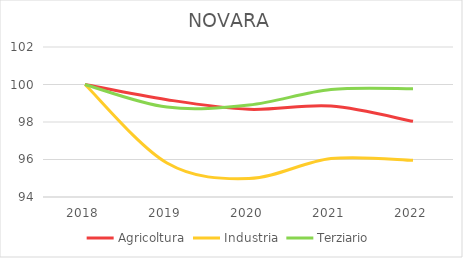
| Category | Agricoltura | Industria | Terziario |
|---|---|---|---|
| 2018.0 | 100 | 100 | 100 |
| 2019.0 | 99.189 | 95.815 | 98.795 |
| 2020.0 | 98.676 | 94.988 | 98.907 |
| 2021.0 | 98.847 | 96.049 | 99.731 |
| 2022.0 | 98.036 | 95.958 | 99.771 |